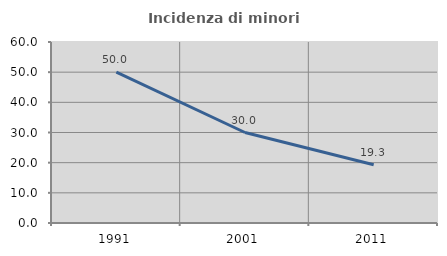
| Category | Incidenza di minori stranieri |
|---|---|
| 1991.0 | 50 |
| 2001.0 | 30 |
| 2011.0 | 19.31 |